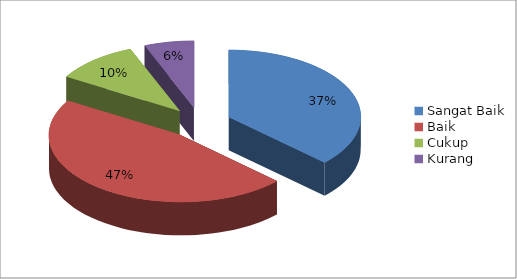
| Category | Series 0 |
|---|---|
| Sangat Baik | 36.96 |
| Baik | 46.48 |
| Cukup | 10.28 |
| Kurang | 6.07 |